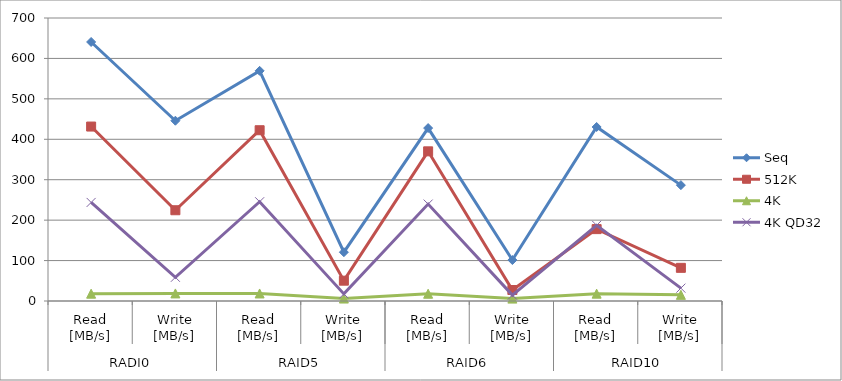
| Category | Seq | 512K | 4K | 4K QD32 |
|---|---|---|---|---|
| 0 | 640.7 | 431.5 | 18.09 | 243.8 |
| 1 | 445.9 | 224.5 | 18.72 | 58.63 |
| 2 | 569.3 | 422.4 | 18.61 | 245.5 |
| 3 | 120.7 | 50.27 | 6.064 | 17.57 |
| 4 | 427.7 | 370.2 | 17.96 | 239.7 |
| 5 | 101.3 | 27.17 | 5.915 | 14.64 |
| 6 | 430.4 | 177.8 | 18.16 | 187.2 |
| 7 | 286.6 | 82.02 | 15.2 | 31.79 |